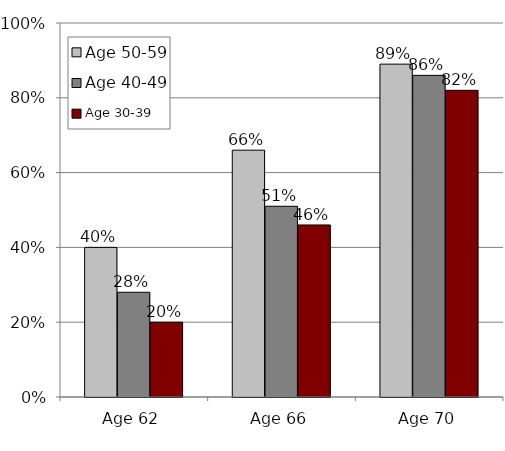
| Category | Age 50-59 | Age 40-49 | Age 30-39 |
|---|---|---|---|
| Age 62 | 0.4 | 0.28 | 0.2 |
| Age 66 | 0.66 | 0.51 | 0.46 |
| Age 70 | 0.89 | 0.86 | 0.82 |